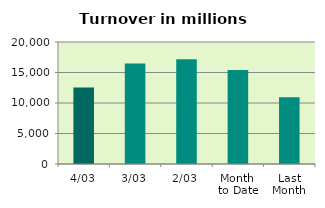
| Category | Series 0 |
|---|---|
| 4/03 | 12560.489 |
| 3/03 | 16486.331 |
| 2/03 | 17186.207 |
| Month 
to Date | 15411.009 |
| Last
Month | 10948.033 |